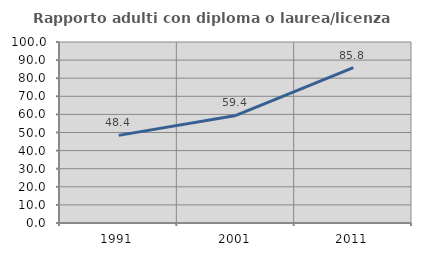
| Category | Rapporto adulti con diploma o laurea/licenza media  |
|---|---|
| 1991.0 | 48.401 |
| 2001.0 | 59.434 |
| 2011.0 | 85.827 |